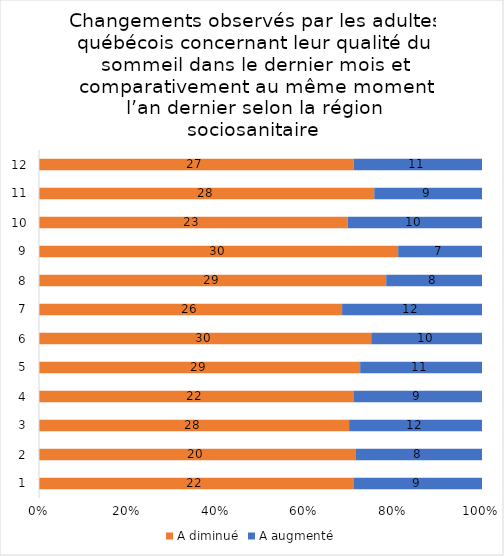
| Category | A diminué | A augmenté |
|---|---|---|
| 0 | 22 | 9 |
| 1 | 20 | 8 |
| 2 | 28 | 12 |
| 3 | 22 | 9 |
| 4 | 29 | 11 |
| 5 | 30 | 10 |
| 6 | 26 | 12 |
| 7 | 29 | 8 |
| 8 | 30 | 7 |
| 9 | 23 | 10 |
| 10 | 28 | 9 |
| 11 | 27 | 11 |